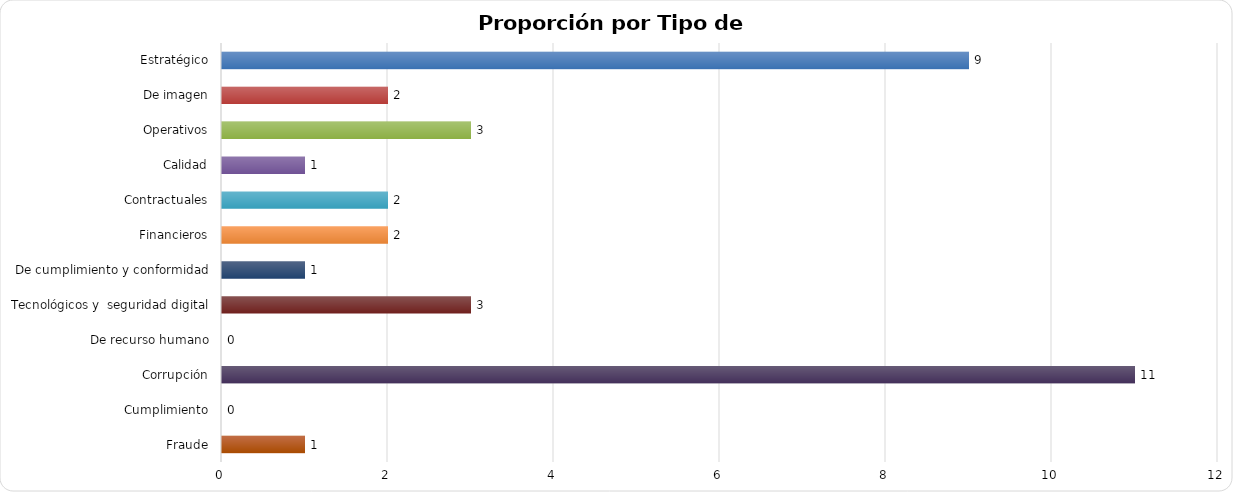
| Category | Series 0 |
|---|---|
| Estratégico | 9 |
| De imagen | 2 |
| Operativos | 3 |
| Calidad | 1 |
| Contractuales | 2 |
| Financieros | 2 |
| De cumplimiento y conformidad | 1 |
| Tecnológicos y  seguridad digital | 3 |
| De recurso humano | 0 |
| Corrupción | 11 |
| Cumplimiento | 0 |
| Fraude | 1 |